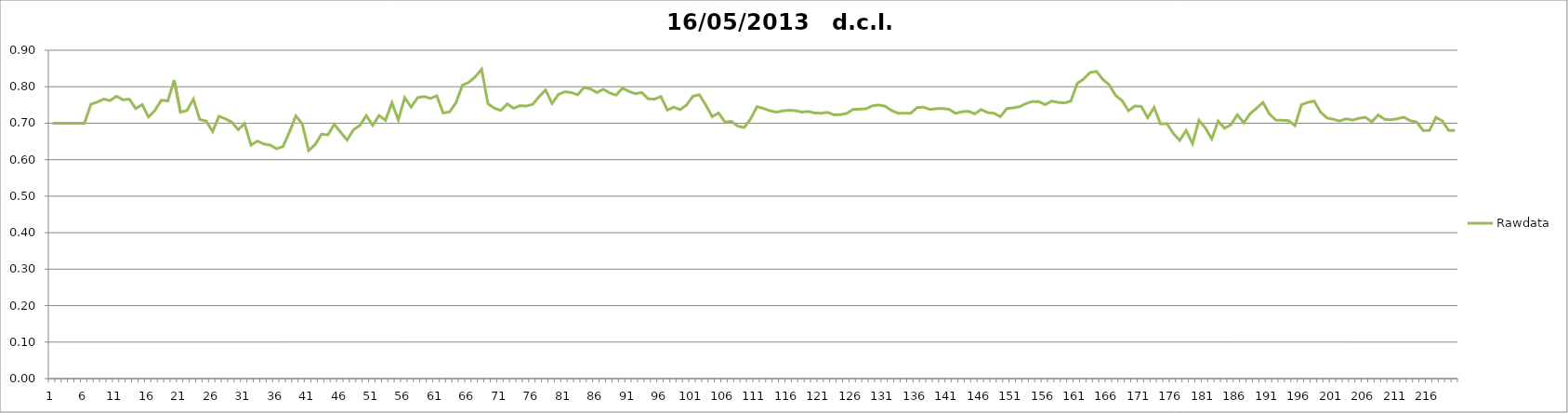
| Category | Rawdata |
|---|---|
| 0 | 0.7 |
| 1 | 0.7 |
| 2 | 0.7 |
| 3 | 0.7 |
| 4 | 0.7 |
| 5 | 0.7 |
| 6 | 0.752 |
| 7 | 0.758 |
| 8 | 0.766 |
| 9 | 0.762 |
| 10 | 0.774 |
| 11 | 0.764 |
| 12 | 0.766 |
| 13 | 0.74 |
| 14 | 0.751 |
| 15 | 0.717 |
| 16 | 0.735 |
| 17 | 0.763 |
| 18 | 0.761 |
| 19 | 0.818 |
| 20 | 0.73 |
| 21 | 0.735 |
| 22 | 0.766 |
| 23 | 0.71 |
| 24 | 0.706 |
| 25 | 0.677 |
| 26 | 0.719 |
| 27 | 0.712 |
| 28 | 0.703 |
| 29 | 0.682 |
| 30 | 0.699 |
| 31 | 0.64 |
| 32 | 0.651 |
| 33 | 0.643 |
| 34 | 0.64 |
| 35 | 0.63 |
| 36 | 0.636 |
| 37 | 0.676 |
| 38 | 0.72 |
| 39 | 0.698 |
| 40 | 0.625 |
| 41 | 0.641 |
| 42 | 0.67 |
| 43 | 0.668 |
| 44 | 0.697 |
| 45 | 0.675 |
| 46 | 0.654 |
| 47 | 0.682 |
| 48 | 0.694 |
| 49 | 0.721 |
| 50 | 0.694 |
| 51 | 0.721 |
| 52 | 0.708 |
| 53 | 0.756 |
| 54 | 0.709 |
| 55 | 0.77 |
| 56 | 0.744 |
| 57 | 0.77 |
| 58 | 0.773 |
| 59 | 0.768 |
| 60 | 0.775 |
| 61 | 0.728 |
| 62 | 0.731 |
| 63 | 0.756 |
| 64 | 0.804 |
| 65 | 0.812 |
| 66 | 0.827 |
| 67 | 0.848 |
| 68 | 0.753 |
| 69 | 0.741 |
| 70 | 0.735 |
| 71 | 0.753 |
| 72 | 0.741 |
| 73 | 0.748 |
| 74 | 0.747 |
| 75 | 0.752 |
| 76 | 0.773 |
| 77 | 0.791 |
| 78 | 0.754 |
| 79 | 0.779 |
| 80 | 0.786 |
| 81 | 0.784 |
| 82 | 0.778 |
| 83 | 0.798 |
| 84 | 0.794 |
| 85 | 0.784 |
| 86 | 0.793 |
| 87 | 0.783 |
| 88 | 0.777 |
| 89 | 0.796 |
| 90 | 0.787 |
| 91 | 0.781 |
| 92 | 0.784 |
| 93 | 0.767 |
| 94 | 0.766 |
| 95 | 0.773 |
| 96 | 0.736 |
| 97 | 0.744 |
| 98 | 0.737 |
| 99 | 0.75 |
| 100 | 0.774 |
| 101 | 0.778 |
| 102 | 0.75 |
| 103 | 0.718 |
| 104 | 0.728 |
| 105 | 0.703 |
| 106 | 0.705 |
| 107 | 0.692 |
| 108 | 0.688 |
| 109 | 0.712 |
| 110 | 0.745 |
| 111 | 0.741 |
| 112 | 0.734 |
| 113 | 0.73 |
| 114 | 0.734 |
| 115 | 0.735 |
| 116 | 0.735 |
| 117 | 0.731 |
| 118 | 0.732 |
| 119 | 0.728 |
| 120 | 0.727 |
| 121 | 0.73 |
| 122 | 0.723 |
| 123 | 0.724 |
| 124 | 0.727 |
| 125 | 0.738 |
| 126 | 0.739 |
| 127 | 0.739 |
| 128 | 0.748 |
| 129 | 0.75 |
| 130 | 0.747 |
| 131 | 0.735 |
| 132 | 0.728 |
| 133 | 0.727 |
| 134 | 0.727 |
| 135 | 0.743 |
| 136 | 0.744 |
| 137 | 0.738 |
| 138 | 0.74 |
| 139 | 0.74 |
| 140 | 0.738 |
| 141 | 0.727 |
| 142 | 0.731 |
| 143 | 0.733 |
| 144 | 0.726 |
| 145 | 0.738 |
| 146 | 0.729 |
| 147 | 0.727 |
| 148 | 0.718 |
| 149 | 0.74 |
| 150 | 0.742 |
| 151 | 0.745 |
| 152 | 0.754 |
| 153 | 0.76 |
| 154 | 0.759 |
| 155 | 0.751 |
| 156 | 0.761 |
| 157 | 0.757 |
| 158 | 0.756 |
| 159 | 0.76 |
| 160 | 0.809 |
| 161 | 0.821 |
| 162 | 0.839 |
| 163 | 0.842 |
| 164 | 0.82 |
| 165 | 0.805 |
| 166 | 0.776 |
| 167 | 0.762 |
| 168 | 0.734 |
| 169 | 0.747 |
| 170 | 0.746 |
| 171 | 0.715 |
| 172 | 0.743 |
| 173 | 0.698 |
| 174 | 0.699 |
| 175 | 0.672 |
| 176 | 0.653 |
| 177 | 0.68 |
| 178 | 0.644 |
| 179 | 0.708 |
| 180 | 0.687 |
| 181 | 0.657 |
| 182 | 0.706 |
| 183 | 0.686 |
| 184 | 0.696 |
| 185 | 0.723 |
| 186 | 0.701 |
| 187 | 0.726 |
| 188 | 0.741 |
| 189 | 0.757 |
| 190 | 0.726 |
| 191 | 0.708 |
| 192 | 0.708 |
| 193 | 0.707 |
| 194 | 0.694 |
| 195 | 0.75 |
| 196 | 0.757 |
| 197 | 0.76 |
| 198 | 0.73 |
| 199 | 0.714 |
| 200 | 0.71 |
| 201 | 0.706 |
| 202 | 0.712 |
| 203 | 0.708 |
| 204 | 0.714 |
| 205 | 0.716 |
| 206 | 0.704 |
| 207 | 0.722 |
| 208 | 0.71 |
| 209 | 0.71 |
| 210 | 0.712 |
| 211 | 0.716 |
| 212 | 0.707 |
| 213 | 0.703 |
| 214 | 0.68 |
| 215 | 0.68 |
| 216 | 0.716 |
| 217 | 0.706 |
| 218 | 0.68 |
| 219 | 0.68 |